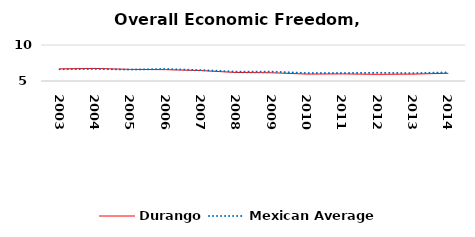
| Category | Durango | Mexican Average  |
|---|---|---|
| 2003.0 | 6.686 | 6.632 |
| 2004.0 | 6.746 | 6.678 |
| 2005.0 | 6.615 | 6.582 |
| 2006.0 | 6.576 | 6.668 |
| 2007.0 | 6.446 | 6.508 |
| 2008.0 | 6.18 | 6.3 |
| 2009.0 | 6.143 | 6.3 |
| 2010.0 | 5.963 | 6.105 |
| 2011.0 | 5.988 | 6.103 |
| 2012.0 | 5.928 | 6.144 |
| 2013.0 | 5.96 | 6.087 |
| 2014.0 | 6.075 | 6.195 |